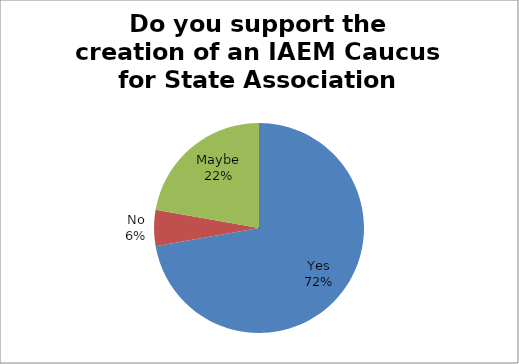
| Category | Do you support the creation of an IAEM Caucus for State Association Presidents? n=36_x000d_2 |
|---|---|
| Yes | 26 |
| No | 2 |
| Maybe | 8 |